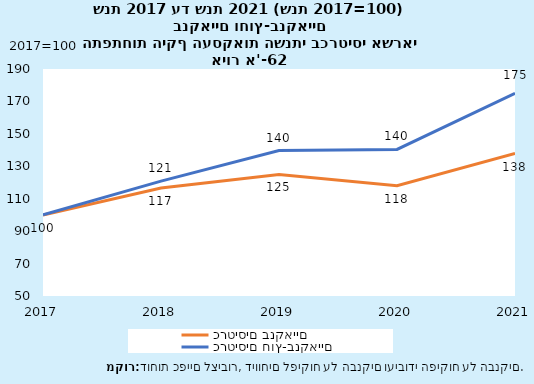
| Category | כרטיסים בנקאיים | כרטיסים חוץ-בנקאיים |
|---|---|---|
| 2017-12-31 | 100 | 100 |
| 2018-12-31 | 116.582 | 120.875 |
| 2019-12-31 | 124.949 | 139.73 |
| 2020-12-31 | 118.056 | 140.377 |
| 2021-12-31 | 137.866 | 175.001 |